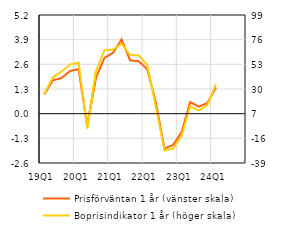
| Category | Prisförväntan 1 år (vänster skala) |
|---|---|
| 19Q1 | 1.015 |
| 19Q2 | 1.76 |
| 19Q3 | 1.875 |
| 19Q4 | 2.248 |
| 20Q1 | 2.346 |
| 20Q2 | -0.631 |
| 20Q3 | 1.875 |
| 20Q4 | 2.938 |
| 21Q1 | 3.203 |
| 21Q2 | 3.91 |
| 21Q3 | 2.808 |
| 21Q4 | 2.764 |
| 22Q1 | 2.344 |
| 22Q2 | 0.591 |
| 22Q3 | -1.839 |
| 22Q4 | -1.652 |
| 23Q1 | -0.97 |
| 23Q2 | 0.611 |
| 23Q3 | 0.369 |
| 23Q4 | 0.565 |
| 24Q1 | 1.369 |